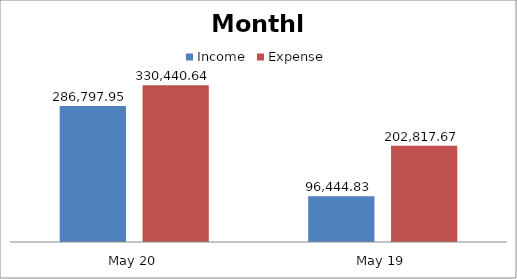
| Category | Income | Expense |
|---|---|---|
| May 20 | 286797.95 | 330440.64 |
| May 19 | 96444.83 | 202817.67 |